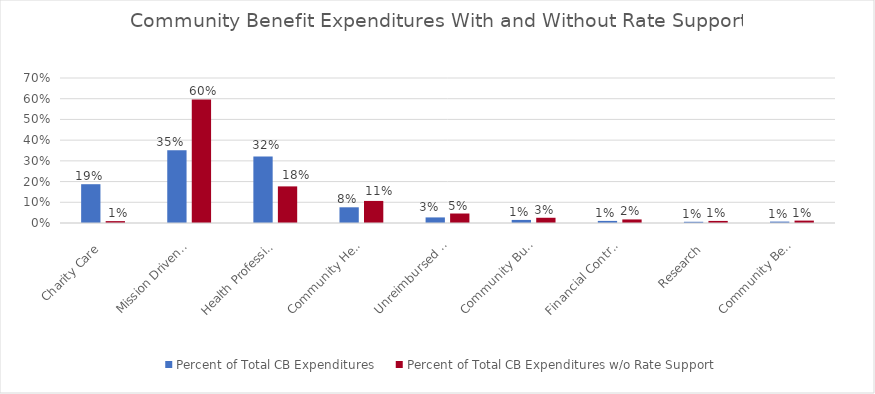
| Category | Percent of Total CB Expenditures | Percent of Total CB Expenditures w/o Rate Support |
|---|---|---|
| Charity Care | 0.187 | 0.009 |
| Mission Driven Health Services | 0.351 | 0.596 |
| Health Professions Education | 0.32 | 0.177 |
| Community Health Services | 0.076 | 0.107 |
| Unreimbursed Medicaid Cost | 0.027 | 0.046 |
| Community Building | 0.015 | 0.025 |
| Financial Contributions | 0.01 | 0.017 |
| Research | 0.006 | 0.01 |
| Community Benefit Operations | 0.007 | 0.012 |